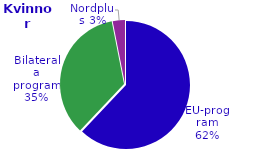
| Category | Series 0 |
|---|---|
| EU-program | 4484 |
| Bilaterala program | 2520 |
| Nordplus | 223 |